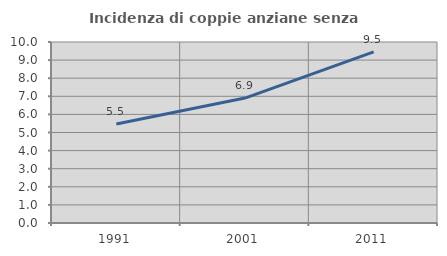
| Category | Incidenza di coppie anziane senza figli  |
|---|---|
| 1991.0 | 5.469 |
| 2001.0 | 6.902 |
| 2011.0 | 9.453 |